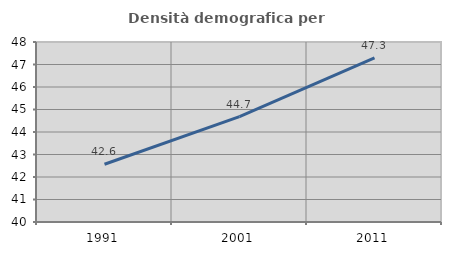
| Category | Densità demografica |
|---|---|
| 1991.0 | 42.567 |
| 2001.0 | 44.683 |
| 2011.0 | 47.297 |